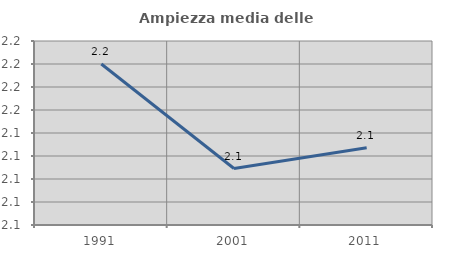
| Category | Ampiezza media delle famiglie |
|---|---|
| 1991.0 | 2.19 |
| 2001.0 | 2.099 |
| 2011.0 | 2.117 |